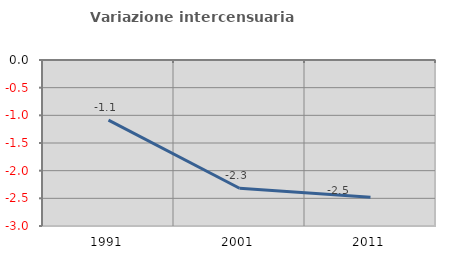
| Category | Variazione intercensuaria annua |
|---|---|
| 1991.0 | -1.086 |
| 2001.0 | -2.318 |
| 2011.0 | -2.479 |